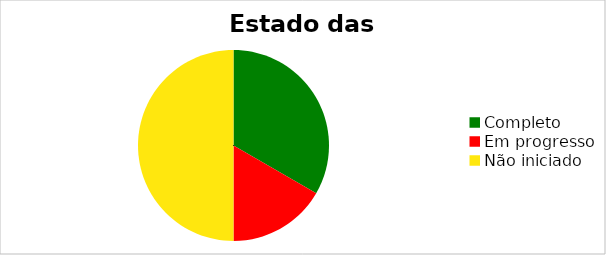
| Category | Series 0 |
|---|---|
| Completo | 0.333 |
| Em progresso | 0.167 |
| Não iniciado | 0.5 |